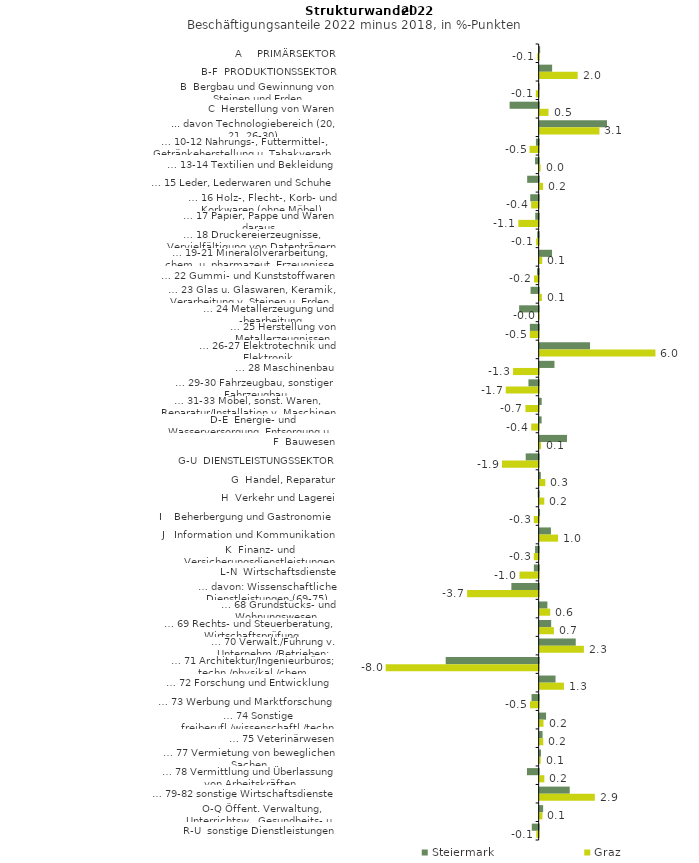
| Category | Steiermark | Graz |
|---|---|---|
| A     PRIMÄRSEKTOR | 0.025 | -0.07 |
| B-F  PRODUKTIONSSEKTOR | 0.65 | 1.983 |
| B  Bergbau und Gewinnung von Steinen und Erden | -0.011 | -0.148 |
| C  Herstellung von Waren | -1.516 | 0.463 |
| ... davon Technologiebereich (20, 21, 26-30) | 3.513 | 3.119 |
| … 10-12 Nahrungs-, Futtermittel-, Getränkeherstellung u. Tabakverarb. | -0.143 | -0.475 |
| … 13-14 Textilien und Bekleidung | -0.189 | 0.048 |
| … 15 Leder, Lederwaren und Schuhe | -0.6 | 0.18 |
| … 16 Holz-, Flecht-, Korb- und Korkwaren (ohne Möbel)  | -0.44 | -0.394 |
| … 17 Papier, Pappe und Waren daraus  | -0.178 | -1.061 |
| … 18 Druckereierzeugnisse, Vervielfältigung von Datenträgern | -0.077 | -0.131 |
| … 19-21 Mineralölverarbeitung, chem. u. pharmazeut. Erzeugnisse | 0.646 | 0.133 |
| … 22 Gummi- und Kunststoffwaren | -0.089 | -0.241 |
| … 23 Glas u. Glaswaren, Keramik, Verarbeitung v. Steinen u. Erden  | -0.424 | 0.116 |
| … 24 Metallerzeugung und -bearbeitung | -1.019 | -0.006 |
| … 25 Herstellung von Metallerzeugnissen  | -0.459 | -0.463 |
| … 26-27 Elektrotechnik und Elektronik | 2.628 | 6.04 |
| … 28 Maschinenbau | 0.773 | -1.335 |
| … 29-30 Fahrzeugbau, sonstiger Fahrzeugbau | -0.534 | -1.715 |
| … 31-33 Möbel, sonst. Waren, Reparatur/Installation v. Maschinen | 0.106 | -0.691 |
| D-E  Energie- und Wasserversorgung, Entsorgung u. Rückgewinnung | 0.102 | -0.388 |
| F  Bauwesen | 1.424 | 0.072 |
| G-U  DIENSTLEISTUNGSSEKTOR | -0.676 | -1.914 |
| G  Handel, Reparatur | 0.059 | 0.294 |
| H  Verkehr und Lagerei | -0.05 | 0.241 |
| I    Beherbergung und Gastronomie | 0.02 | -0.256 |
| J   Information und Kommunikation | 0.588 | 0.959 |
| K  Finanz- und Versicherungsdienstleistungen | -0.188 | -0.256 |
| L-N  Wirtschaftsdienste | -0.252 | -1.002 |
| … davon: Wissenschaftliche Dienstleistungen (69-75) | -1.425 | -3.734 |
| … 68 Grundstücks- und Wohnungswesen  | 0.402 | 0.552 |
| … 69 Rechts- und Steuerberatung, Wirtschaftsprüfung | 0.6 | 0.743 |
| … 70 Verwalt./Führung v. Unternehm./Betrieben; Unternehmensberat. | 1.883 | 2.308 |
| … 71 Architektur/Ingenieurbüros; techn./physikal./chem. Untersuchung | -4.85 | -7.982 |
| … 72 Forschung und Entwicklung  | 0.828 | 1.267 |
| … 73 Werbung und Marktforschung | -0.372 | -0.454 |
| … 74 Sonstige freiberufl./wissenschaftl./techn. Tätigkeiten | 0.334 | 0.2 |
| … 75 Veterinärwesen | 0.152 | 0.188 |
| … 77 Vermietung von beweglichen Sachen  | 0.067 | 0.053 |
| … 78 Vermittlung und Überlassung von Arbeitskräften | -0.611 | 0.245 |
| … 79-82 sonstige Wirtschaftsdienste | 1.569 | 2.879 |
| O-Q Öffent. Verwaltung, Unterrichtsw., Gesundheits- u. Sozialwesen | 0.182 | 0.144 |
| R-U  sonstige Dienstleistungen | -0.359 | -0.123 |